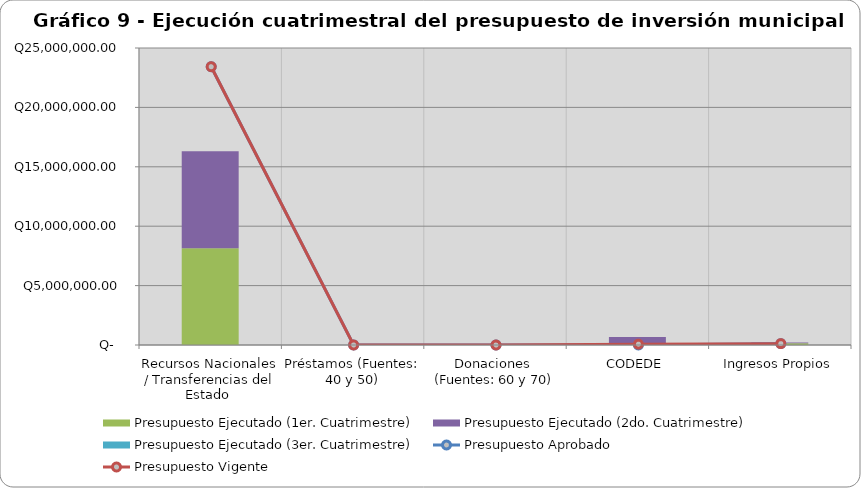
| Category | Presupuesto Ejecutado (1er. Cuatrimestre) | Presupuesto Ejecutado (2do. Cuatrimestre) | Presupuesto Ejecutado (3er. Cuatrimestre) |
|---|---|---|---|
| Recursos Nacionales / Transferencias del Estado  | 8142638.96 | 8168835.11 | 0 |
| Préstamos (Fuentes: 40 y 50) | 0 | 0 | 0 |
| Donaciones  (Fuentes: 60 y 70) | 0 | 0 | 0 |
| CODEDE | 69338.68 | 599130.6 | 0 |
| Ingresos Propios | 150639.26 | 65306.73 | 0 |